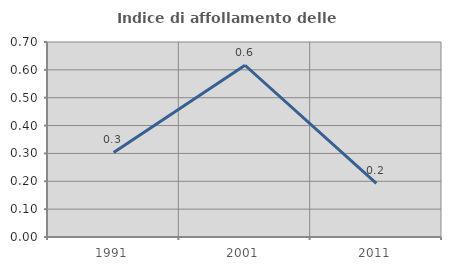
| Category | Indice di affollamento delle abitazioni  |
|---|---|
| 1991.0 | 0.303 |
| 2001.0 | 0.617 |
| 2011.0 | 0.192 |